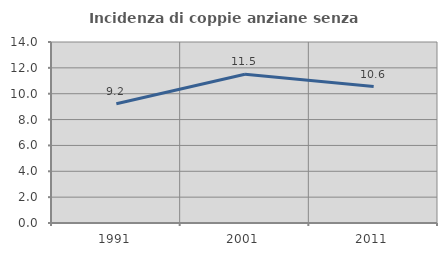
| Category | Incidenza di coppie anziane senza figli  |
|---|---|
| 1991.0 | 9.22 |
| 2001.0 | 11.512 |
| 2011.0 | 10.558 |